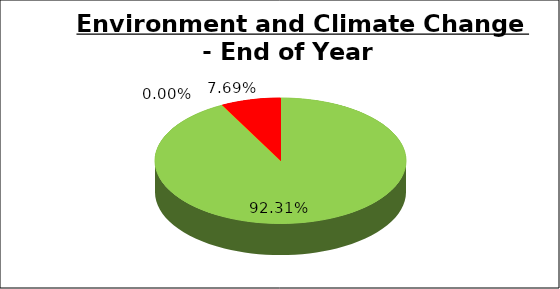
| Category | Q4 |
|---|---|
| Green | 0.923 |
| Amber | 0 |
| Red | 0.077 |